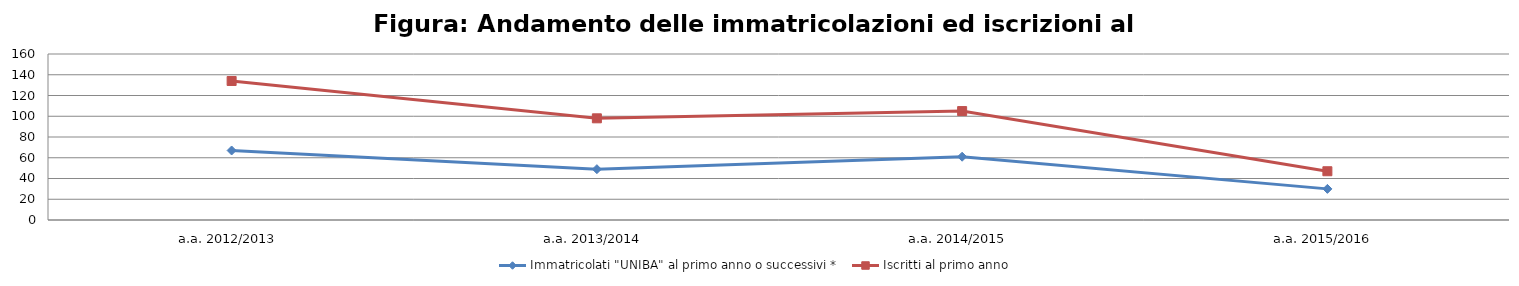
| Category | Immatricolati "UNIBA" al primo anno o successivi * | Iscritti al primo anno  |
|---|---|---|
| a.a. 2012/2013 | 67 | 134 |
| a.a. 2013/2014 | 49 | 98 |
| a.a. 2014/2015 | 61 | 105 |
| a.a. 2015/2016 | 30 | 47 |